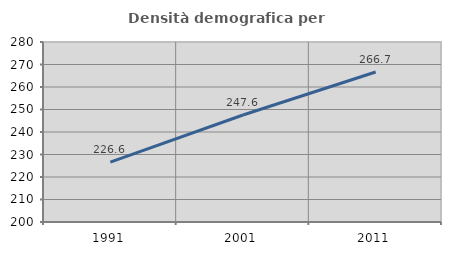
| Category | Densità demografica |
|---|---|
| 1991.0 | 226.582 |
| 2001.0 | 247.557 |
| 2011.0 | 266.671 |